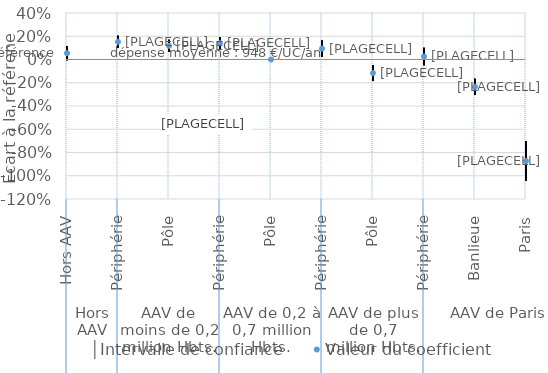
| Category | │Intervalle de confiance | Series 1 | Valeur du coefficient |
|---|---|---|---|
| 0 | 0.115 | -0.006 | 0.054 |
| 1 | 0.205 | 0.099 | 0.152 |
| 2 | 0.17 | 0.065 | 0.117 |
| 3 | 0.193 | 0.088 | 0.14 |
| 4 | 0 | 0 | 0 |
| 5 | 0.164 | 0.024 | 0.094 |
| 6 | -0.048 | -0.185 | -0.116 |
| 7 | 0.101 | -0.05 | 0.026 |
| 8 | -0.166 | -0.304 | -0.235 |
| 9 | -0.702 | -1.044 | -0.873 |